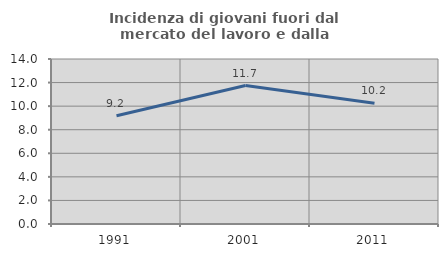
| Category | Incidenza di giovani fuori dal mercato del lavoro e dalla formazione  |
|---|---|
| 1991.0 | 9.184 |
| 2001.0 | 11.745 |
| 2011.0 | 10.239 |